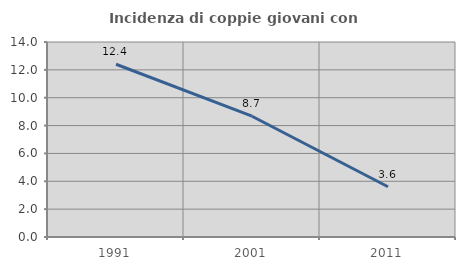
| Category | Incidenza di coppie giovani con figli |
|---|---|
| 1991.0 | 12.401 |
| 2001.0 | 8.672 |
| 2011.0 | 3.608 |